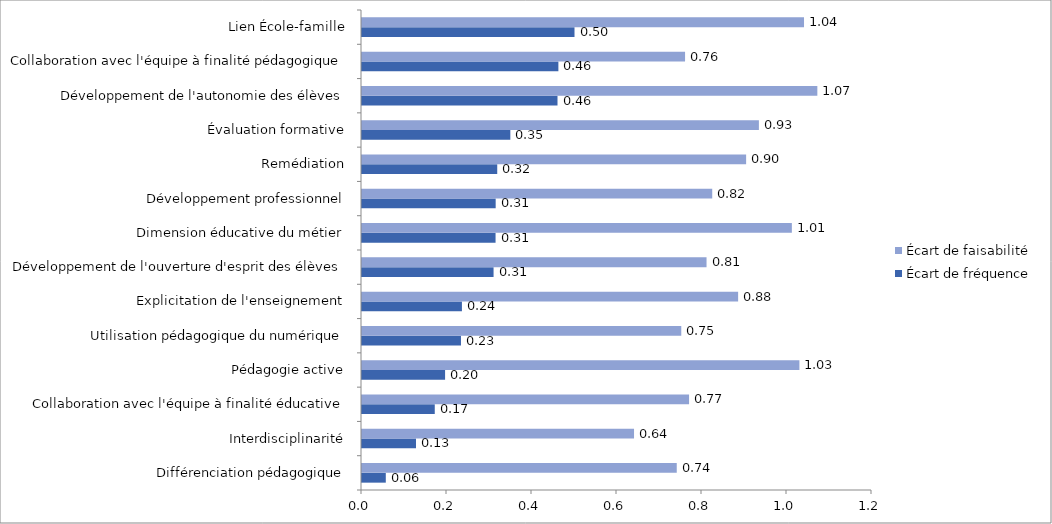
| Category | Écart de fréquence | Écart de faisabilité |
|---|---|---|
| Différenciation pédagogique | 0.056 | 0.741 |
| Interdisciplinarité | 0.127 | 0.64 |
| Collaboration avec l'équipe à finalité éducative | 0.171 | 0.77 |
| Pédagogie active | 0.195 | 1.029 |
| Utilisation pédagogique du numérique | 0.233 | 0.751 |
| Explicitation de l'enseignement | 0.235 | 0.885 |
| Développement de l'ouverture d'esprit des élèves | 0.31 | 0.811 |
| Dimension éducative du métier | 0.314 | 1.011 |
| Développement professionnel | 0.315 | 0.824 |
| Remédiation | 0.318 | 0.904 |
| Évaluation formative | 0.349 | 0.934 |
| Développement de l'autonomie des élèves | 0.46 | 1.071 |
| Collaboration avec l'équipe à finalité pédagogique | 0.462 | 0.76 |
| Lien École-famille | 0.5 | 1.04 |